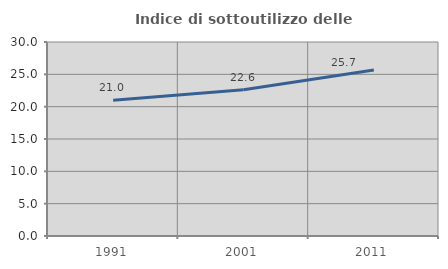
| Category | Indice di sottoutilizzo delle abitazioni  |
|---|---|
| 1991.0 | 20.996 |
| 2001.0 | 22.629 |
| 2011.0 | 25.684 |